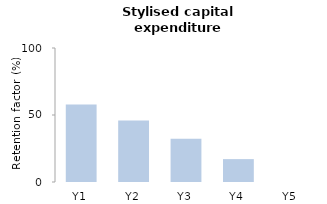
| Category | Capex |
|---|---|
| 1.0 | 57.917 |
| 2.0 | 45.869 |
| 3.0 | 32.306 |
| 4.0 | 17.074 |
| 5.0 | 0 |